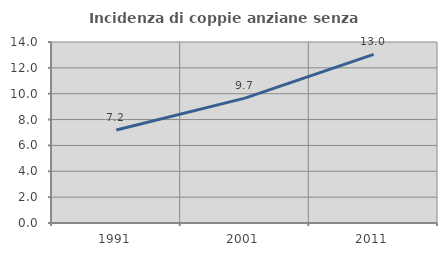
| Category | Incidenza di coppie anziane senza figli  |
|---|---|
| 1991.0 | 7.19 |
| 2001.0 | 9.658 |
| 2011.0 | 13.043 |